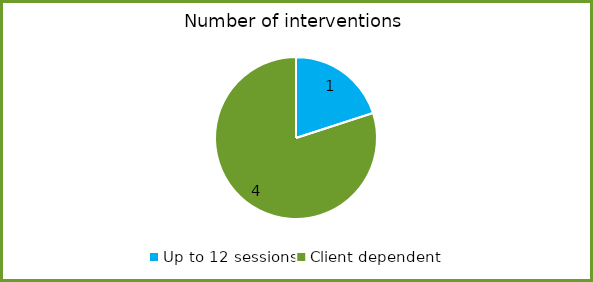
| Category | Series 0 |
|---|---|
| Up to 12 sessions | 1 |
| Client dependent | 4 |